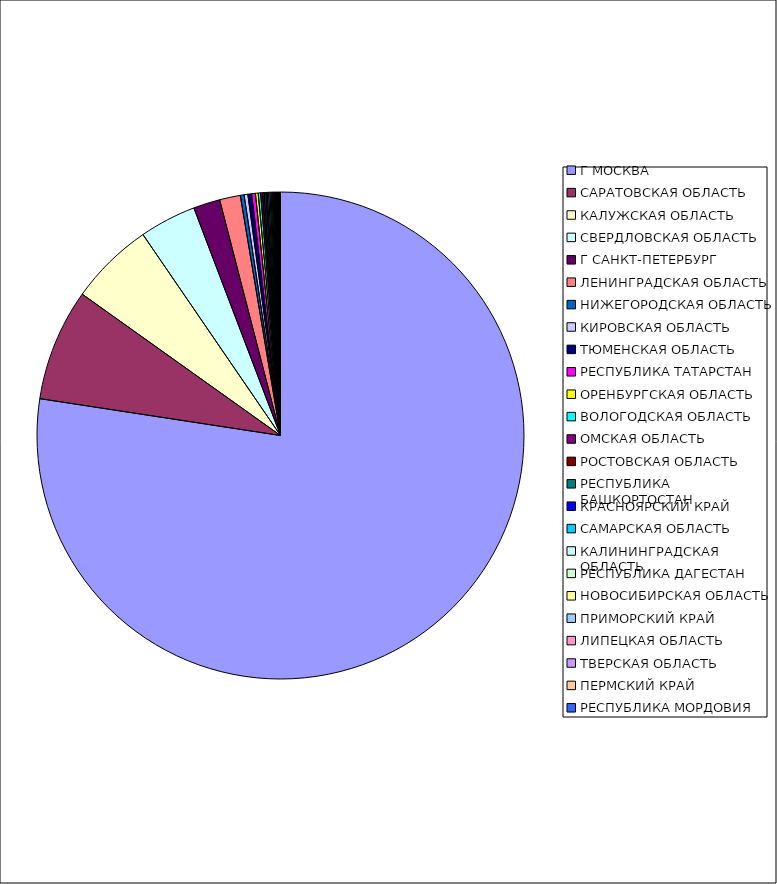
| Category | Оборот |
|---|---|
| Г МОСКВА | 0.774 |
| САРАТОВСКАЯ ОБЛАСТЬ | 0.074 |
| КАЛУЖСКАЯ ОБЛАСТЬ | 0.056 |
| СВЕРДЛОВСКАЯ ОБЛАСТЬ | 0.038 |
| Г САНКТ-ПЕТЕРБУРГ | 0.018 |
| ЛЕНИНГРАДСКАЯ ОБЛАСТЬ | 0.014 |
| НИЖЕГОРОДСКАЯ ОБЛАСТЬ | 0.003 |
| КИРОВСКАЯ ОБЛАСТЬ | 0.002 |
| ТЮМЕНСКАЯ ОБЛАСТЬ | 0.002 |
| РЕСПУБЛИКА ТАТАРСТАН | 0.002 |
| ОРЕНБУРГСКАЯ ОБЛАСТЬ | 0.002 |
| ВОЛОГОДСКАЯ ОБЛАСТЬ | 0.002 |
| ОМСКАЯ ОБЛАСТЬ | 0.001 |
| РОСТОВСКАЯ ОБЛАСТЬ | 0.001 |
| РЕСПУБЛИКА БАШКОРТОСТАН | 0.001 |
| КРАСНОЯРСКИЙ КРАЙ | 0.001 |
| САМАРСКАЯ ОБЛАСТЬ | 0.001 |
| КАЛИНИНГРАДСКАЯ ОБЛАСТЬ | 0.001 |
| РЕСПУБЛИКА ДАГЕСТАН | 0.001 |
| НОВОСИБИРСКАЯ ОБЛАСТЬ | 0.001 |
| ПРИМОРСКИЙ КРАЙ | 0.001 |
| ЛИПЕЦКАЯ ОБЛАСТЬ | 0.001 |
| ТВЕРСКАЯ ОБЛАСТЬ | 0 |
| ПЕРМСКИЙ КРАЙ | 0 |
| РЕСПУБЛИКА МОРДОВИЯ | 0 |
| РЕСПУБЛИКА СЕВЕРНАЯ ОСЕТИЯ-АЛАНИЯ | 0 |
| РЯЗАНСКАЯ ОБЛАСТЬ | 0 |
| ЧЕЛЯБИНСКАЯ ОБЛАСТЬ | 0 |
| КРАСНОДАРСКИЙ КРАЙ | 0 |
| ИРКУТСКАЯ ОБЛАСТЬ | 0 |
| ПСКОВСКАЯ ОБЛАСТЬ | 0 |
| ИВАНОВСКАЯ ОБЛАСТЬ | 0 |
| ЯРОСЛАВСКАЯ ОБЛАСТЬ | 0 |
| УДМУРТСКАЯ РЕСПУБЛИКА | 0 |
| КАБАРДИНО-БАЛКАРСКАЯ РЕСПУБЛИКА | 0 |
| БЕЛГОРОДСКАЯ ОБЛАСТЬ | 0 |
| АЛТАЙСКИЙ КРАЙ | 0 |
| КЕМЕРОВСКАЯ ОБЛАСТЬ | 0 |
| РЕСПУБЛИКА КОМИ | 0 |
| РЕСПУБЛИКА ХАКАСИЯ | 0 |
| МОСКОВСКАЯ ОБЛАСТЬ | 0 |
| ТУЛЬСКАЯ ОБЛАСТЬ | 0 |
| СМОЛЕНСКАЯ ОБЛАСТЬ | 0 |